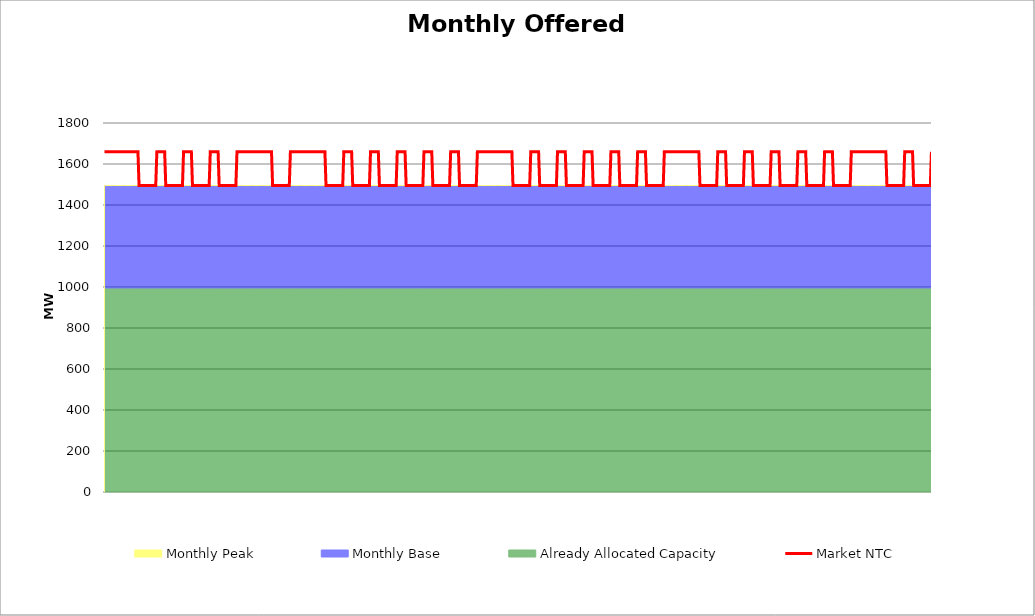
| Category | Market NTC |
|---|---|
| 0 | 1660 |
| 1 | 1660 |
| 2 | 1660 |
| 3 | 1660 |
| 4 | 1660 |
| 5 | 1660 |
| 6 | 1660 |
| 7 | 1660 |
| 8 | 1660 |
| 9 | 1660 |
| 10 | 1660 |
| 11 | 1660 |
| 12 | 1660 |
| 13 | 1660 |
| 14 | 1660 |
| 15 | 1660 |
| 16 | 1660 |
| 17 | 1660 |
| 18 | 1660 |
| 19 | 1660 |
| 20 | 1660 |
| 21 | 1660 |
| 22 | 1660 |
| 23 | 1660 |
| 24 | 1660 |
| 25 | 1660 |
| 26 | 1660 |
| 27 | 1660 |
| 28 | 1660 |
| 29 | 1660 |
| 30 | 1660 |
| 31 | 1495 |
| 32 | 1495 |
| 33 | 1495 |
| 34 | 1495 |
| 35 | 1495 |
| 36 | 1495 |
| 37 | 1495 |
| 38 | 1495 |
| 39 | 1495 |
| 40 | 1495 |
| 41 | 1495 |
| 42 | 1495 |
| 43 | 1495 |
| 44 | 1495 |
| 45 | 1495 |
| 46 | 1495 |
| 47 | 1660 |
| 48 | 1660 |
| 49 | 1660 |
| 50 | 1660 |
| 51 | 1660 |
| 52 | 1660 |
| 53 | 1660 |
| 54 | 1660 |
| 55 | 1495 |
| 56 | 1495 |
| 57 | 1495 |
| 58 | 1495 |
| 59 | 1495 |
| 60 | 1495 |
| 61 | 1495 |
| 62 | 1495 |
| 63 | 1495 |
| 64 | 1495 |
| 65 | 1495 |
| 66 | 1495 |
| 67 | 1495 |
| 68 | 1495 |
| 69 | 1495 |
| 70 | 1495 |
| 71 | 1660 |
| 72 | 1660 |
| 73 | 1660 |
| 74 | 1660 |
| 75 | 1660 |
| 76 | 1660 |
| 77 | 1660 |
| 78 | 1660 |
| 79 | 1495 |
| 80 | 1495 |
| 81 | 1495 |
| 82 | 1495 |
| 83 | 1495 |
| 84 | 1495 |
| 85 | 1495 |
| 86 | 1495 |
| 87 | 1495 |
| 88 | 1495 |
| 89 | 1495 |
| 90 | 1495 |
| 91 | 1495 |
| 92 | 1495 |
| 93 | 1495 |
| 94 | 1495 |
| 95 | 1660 |
| 96 | 1660 |
| 97 | 1660 |
| 98 | 1660 |
| 99 | 1660 |
| 100 | 1660 |
| 101 | 1660 |
| 102 | 1660 |
| 103 | 1495 |
| 104 | 1495 |
| 105 | 1495 |
| 106 | 1495 |
| 107 | 1495 |
| 108 | 1495 |
| 109 | 1495 |
| 110 | 1495 |
| 111 | 1495 |
| 112 | 1495 |
| 113 | 1495 |
| 114 | 1495 |
| 115 | 1495 |
| 116 | 1495 |
| 117 | 1495 |
| 118 | 1495 |
| 119 | 1660 |
| 120 | 1660 |
| 121 | 1660 |
| 122 | 1660 |
| 123 | 1660 |
| 124 | 1660 |
| 125 | 1660 |
| 126 | 1660 |
| 127 | 1660 |
| 128 | 1660 |
| 129 | 1660 |
| 130 | 1660 |
| 131 | 1660 |
| 132 | 1660 |
| 133 | 1660 |
| 134 | 1660 |
| 135 | 1660 |
| 136 | 1660 |
| 137 | 1660 |
| 138 | 1660 |
| 139 | 1660 |
| 140 | 1660 |
| 141 | 1660 |
| 142 | 1660 |
| 143 | 1660 |
| 144 | 1660 |
| 145 | 1660 |
| 146 | 1660 |
| 147 | 1660 |
| 148 | 1660 |
| 149 | 1660 |
| 150 | 1660 |
| 151 | 1495 |
| 152 | 1495 |
| 153 | 1495 |
| 154 | 1495 |
| 155 | 1495 |
| 156 | 1495 |
| 157 | 1495 |
| 158 | 1495 |
| 159 | 1495 |
| 160 | 1495 |
| 161 | 1495 |
| 162 | 1495 |
| 163 | 1495 |
| 164 | 1495 |
| 165 | 1495 |
| 166 | 1495 |
| 167 | 1660 |
| 168 | 1660 |
| 169 | 1660 |
| 170 | 1660 |
| 171 | 1660 |
| 172 | 1660 |
| 173 | 1660 |
| 174 | 1660 |
| 175 | 1660 |
| 176 | 1660 |
| 177 | 1660 |
| 178 | 1660 |
| 179 | 1660 |
| 180 | 1660 |
| 181 | 1660 |
| 182 | 1660 |
| 183 | 1660 |
| 184 | 1660 |
| 185 | 1660 |
| 186 | 1660 |
| 187 | 1660 |
| 188 | 1660 |
| 189 | 1660 |
| 190 | 1660 |
| 191 | 1660 |
| 192 | 1660 |
| 193 | 1660 |
| 194 | 1660 |
| 195 | 1660 |
| 196 | 1660 |
| 197 | 1660 |
| 198 | 1660 |
| 199 | 1495 |
| 200 | 1495 |
| 201 | 1495 |
| 202 | 1495 |
| 203 | 1495 |
| 204 | 1495 |
| 205 | 1495 |
| 206 | 1495 |
| 207 | 1495 |
| 208 | 1495 |
| 209 | 1495 |
| 210 | 1495 |
| 211 | 1495 |
| 212 | 1495 |
| 213 | 1495 |
| 214 | 1495 |
| 215 | 1660 |
| 216 | 1660 |
| 217 | 1660 |
| 218 | 1660 |
| 219 | 1660 |
| 220 | 1660 |
| 221 | 1660 |
| 222 | 1660 |
| 223 | 1495 |
| 224 | 1495 |
| 225 | 1495 |
| 226 | 1495 |
| 227 | 1495 |
| 228 | 1495 |
| 229 | 1495 |
| 230 | 1495 |
| 231 | 1495 |
| 232 | 1495 |
| 233 | 1495 |
| 234 | 1495 |
| 235 | 1495 |
| 236 | 1495 |
| 237 | 1495 |
| 238 | 1495 |
| 239 | 1660 |
| 240 | 1660 |
| 241 | 1660 |
| 242 | 1660 |
| 243 | 1660 |
| 244 | 1660 |
| 245 | 1660 |
| 246 | 1660 |
| 247 | 1495 |
| 248 | 1495 |
| 249 | 1495 |
| 250 | 1495 |
| 251 | 1495 |
| 252 | 1495 |
| 253 | 1495 |
| 254 | 1495 |
| 255 | 1495 |
| 256 | 1495 |
| 257 | 1495 |
| 258 | 1495 |
| 259 | 1495 |
| 260 | 1495 |
| 261 | 1495 |
| 262 | 1495 |
| 263 | 1660 |
| 264 | 1660 |
| 265 | 1660 |
| 266 | 1660 |
| 267 | 1660 |
| 268 | 1660 |
| 269 | 1660 |
| 270 | 1660 |
| 271 | 1495 |
| 272 | 1495 |
| 273 | 1495 |
| 274 | 1495 |
| 275 | 1495 |
| 276 | 1495 |
| 277 | 1495 |
| 278 | 1495 |
| 279 | 1495 |
| 280 | 1495 |
| 281 | 1495 |
| 282 | 1495 |
| 283 | 1495 |
| 284 | 1495 |
| 285 | 1495 |
| 286 | 1495 |
| 287 | 1660 |
| 288 | 1660 |
| 289 | 1660 |
| 290 | 1660 |
| 291 | 1660 |
| 292 | 1660 |
| 293 | 1660 |
| 294 | 1660 |
| 295 | 1495 |
| 296 | 1495 |
| 297 | 1495 |
| 298 | 1495 |
| 299 | 1495 |
| 300 | 1495 |
| 301 | 1495 |
| 302 | 1495 |
| 303 | 1495 |
| 304 | 1495 |
| 305 | 1495 |
| 306 | 1495 |
| 307 | 1495 |
| 308 | 1495 |
| 309 | 1495 |
| 310 | 1495 |
| 311 | 1660 |
| 312 | 1660 |
| 313 | 1660 |
| 314 | 1660 |
| 315 | 1660 |
| 316 | 1660 |
| 317 | 1660 |
| 318 | 1660 |
| 319 | 1495 |
| 320 | 1495 |
| 321 | 1495 |
| 322 | 1495 |
| 323 | 1495 |
| 324 | 1495 |
| 325 | 1495 |
| 326 | 1495 |
| 327 | 1495 |
| 328 | 1495 |
| 329 | 1495 |
| 330 | 1495 |
| 331 | 1495 |
| 332 | 1495 |
| 333 | 1495 |
| 334 | 1495 |
| 335 | 1660 |
| 336 | 1660 |
| 337 | 1660 |
| 338 | 1660 |
| 339 | 1660 |
| 340 | 1660 |
| 341 | 1660 |
| 342 | 1660 |
| 343 | 1660 |
| 344 | 1660 |
| 345 | 1660 |
| 346 | 1660 |
| 347 | 1660 |
| 348 | 1660 |
| 349 | 1660 |
| 350 | 1660 |
| 351 | 1660 |
| 352 | 1660 |
| 353 | 1660 |
| 354 | 1660 |
| 355 | 1660 |
| 356 | 1660 |
| 357 | 1660 |
| 358 | 1660 |
| 359 | 1660 |
| 360 | 1660 |
| 361 | 1660 |
| 362 | 1660 |
| 363 | 1660 |
| 364 | 1660 |
| 365 | 1660 |
| 366 | 1660 |
| 367 | 1495 |
| 368 | 1495 |
| 369 | 1495 |
| 370 | 1495 |
| 371 | 1495 |
| 372 | 1495 |
| 373 | 1495 |
| 374 | 1495 |
| 375 | 1495 |
| 376 | 1495 |
| 377 | 1495 |
| 378 | 1495 |
| 379 | 1495 |
| 380 | 1495 |
| 381 | 1495 |
| 382 | 1495 |
| 383 | 1660 |
| 384 | 1660 |
| 385 | 1660 |
| 386 | 1660 |
| 387 | 1660 |
| 388 | 1660 |
| 389 | 1660 |
| 390 | 1660 |
| 391 | 1495 |
| 392 | 1495 |
| 393 | 1495 |
| 394 | 1495 |
| 395 | 1495 |
| 396 | 1495 |
| 397 | 1495 |
| 398 | 1495 |
| 399 | 1495 |
| 400 | 1495 |
| 401 | 1495 |
| 402 | 1495 |
| 403 | 1495 |
| 404 | 1495 |
| 405 | 1495 |
| 406 | 1495 |
| 407 | 1660 |
| 408 | 1660 |
| 409 | 1660 |
| 410 | 1660 |
| 411 | 1660 |
| 412 | 1660 |
| 413 | 1660 |
| 414 | 1660 |
| 415 | 1495 |
| 416 | 1495 |
| 417 | 1495 |
| 418 | 1495 |
| 419 | 1495 |
| 420 | 1495 |
| 421 | 1495 |
| 422 | 1495 |
| 423 | 1495 |
| 424 | 1495 |
| 425 | 1495 |
| 426 | 1495 |
| 427 | 1495 |
| 428 | 1495 |
| 429 | 1495 |
| 430 | 1495 |
| 431 | 1660 |
| 432 | 1660 |
| 433 | 1660 |
| 434 | 1660 |
| 435 | 1660 |
| 436 | 1660 |
| 437 | 1660 |
| 438 | 1660 |
| 439 | 1495 |
| 440 | 1495 |
| 441 | 1495 |
| 442 | 1495 |
| 443 | 1495 |
| 444 | 1495 |
| 445 | 1495 |
| 446 | 1495 |
| 447 | 1495 |
| 448 | 1495 |
| 449 | 1495 |
| 450 | 1495 |
| 451 | 1495 |
| 452 | 1495 |
| 453 | 1495 |
| 454 | 1495 |
| 455 | 1660 |
| 456 | 1660 |
| 457 | 1660 |
| 458 | 1660 |
| 459 | 1660 |
| 460 | 1660 |
| 461 | 1660 |
| 462 | 1660 |
| 463 | 1495 |
| 464 | 1495 |
| 465 | 1495 |
| 466 | 1495 |
| 467 | 1495 |
| 468 | 1495 |
| 469 | 1495 |
| 470 | 1495 |
| 471 | 1495 |
| 472 | 1495 |
| 473 | 1495 |
| 474 | 1495 |
| 475 | 1495 |
| 476 | 1495 |
| 477 | 1495 |
| 478 | 1495 |
| 479 | 1660 |
| 480 | 1660 |
| 481 | 1660 |
| 482 | 1660 |
| 483 | 1660 |
| 484 | 1660 |
| 485 | 1660 |
| 486 | 1660 |
| 487 | 1495 |
| 488 | 1495 |
| 489 | 1495 |
| 490 | 1495 |
| 491 | 1495 |
| 492 | 1495 |
| 493 | 1495 |
| 494 | 1495 |
| 495 | 1495 |
| 496 | 1495 |
| 497 | 1495 |
| 498 | 1495 |
| 499 | 1495 |
| 500 | 1495 |
| 501 | 1495 |
| 502 | 1495 |
| 503 | 1660 |
| 504 | 1660 |
| 505 | 1660 |
| 506 | 1660 |
| 507 | 1660 |
| 508 | 1660 |
| 509 | 1660 |
| 510 | 1660 |
| 511 | 1660 |
| 512 | 1660 |
| 513 | 1660 |
| 514 | 1660 |
| 515 | 1660 |
| 516 | 1660 |
| 517 | 1660 |
| 518 | 1660 |
| 519 | 1660 |
| 520 | 1660 |
| 521 | 1660 |
| 522 | 1660 |
| 523 | 1660 |
| 524 | 1660 |
| 525 | 1660 |
| 526 | 1660 |
| 527 | 1660 |
| 528 | 1660 |
| 529 | 1660 |
| 530 | 1660 |
| 531 | 1660 |
| 532 | 1660 |
| 533 | 1660 |
| 534 | 1660 |
| 535 | 1495 |
| 536 | 1495 |
| 537 | 1495 |
| 538 | 1495 |
| 539 | 1495 |
| 540 | 1495 |
| 541 | 1495 |
| 542 | 1495 |
| 543 | 1495 |
| 544 | 1495 |
| 545 | 1495 |
| 546 | 1495 |
| 547 | 1495 |
| 548 | 1495 |
| 549 | 1495 |
| 550 | 1495 |
| 551 | 1660 |
| 552 | 1660 |
| 553 | 1660 |
| 554 | 1660 |
| 555 | 1660 |
| 556 | 1660 |
| 557 | 1660 |
| 558 | 1660 |
| 559 | 1495 |
| 560 | 1495 |
| 561 | 1495 |
| 562 | 1495 |
| 563 | 1495 |
| 564 | 1495 |
| 565 | 1495 |
| 566 | 1495 |
| 567 | 1495 |
| 568 | 1495 |
| 569 | 1495 |
| 570 | 1495 |
| 571 | 1495 |
| 572 | 1495 |
| 573 | 1495 |
| 574 | 1495 |
| 575 | 1660 |
| 576 | 1660 |
| 577 | 1660 |
| 578 | 1660 |
| 579 | 1660 |
| 580 | 1660 |
| 581 | 1660 |
| 582 | 1660 |
| 583 | 1495 |
| 584 | 1495 |
| 585 | 1495 |
| 586 | 1495 |
| 587 | 1495 |
| 588 | 1495 |
| 589 | 1495 |
| 590 | 1495 |
| 591 | 1495 |
| 592 | 1495 |
| 593 | 1495 |
| 594 | 1495 |
| 595 | 1495 |
| 596 | 1495 |
| 597 | 1495 |
| 598 | 1495 |
| 599 | 1660 |
| 600 | 1660 |
| 601 | 1660 |
| 602 | 1660 |
| 603 | 1660 |
| 604 | 1660 |
| 605 | 1660 |
| 606 | 1660 |
| 607 | 1495 |
| 608 | 1495 |
| 609 | 1495 |
| 610 | 1495 |
| 611 | 1495 |
| 612 | 1495 |
| 613 | 1495 |
| 614 | 1495 |
| 615 | 1495 |
| 616 | 1495 |
| 617 | 1495 |
| 618 | 1495 |
| 619 | 1495 |
| 620 | 1495 |
| 621 | 1495 |
| 622 | 1495 |
| 623 | 1660 |
| 624 | 1660 |
| 625 | 1660 |
| 626 | 1660 |
| 627 | 1660 |
| 628 | 1660 |
| 629 | 1660 |
| 630 | 1660 |
| 631 | 1495 |
| 632 | 1495 |
| 633 | 1495 |
| 634 | 1495 |
| 635 | 1495 |
| 636 | 1495 |
| 637 | 1495 |
| 638 | 1495 |
| 639 | 1495 |
| 640 | 1495 |
| 641 | 1495 |
| 642 | 1495 |
| 643 | 1495 |
| 644 | 1495 |
| 645 | 1495 |
| 646 | 1495 |
| 647 | 1660 |
| 648 | 1660 |
| 649 | 1660 |
| 650 | 1660 |
| 651 | 1660 |
| 652 | 1660 |
| 653 | 1660 |
| 654 | 1660 |
| 655 | 1495 |
| 656 | 1495 |
| 657 | 1495 |
| 658 | 1495 |
| 659 | 1495 |
| 660 | 1495 |
| 661 | 1495 |
| 662 | 1495 |
| 663 | 1495 |
| 664 | 1495 |
| 665 | 1495 |
| 666 | 1495 |
| 667 | 1495 |
| 668 | 1495 |
| 669 | 1495 |
| 670 | 1495 |
| 671 | 1660 |
| 672 | 1660 |
| 673 | 1660 |
| 674 | 1660 |
| 675 | 1660 |
| 676 | 1660 |
| 677 | 1660 |
| 678 | 1660 |
| 679 | 1660 |
| 680 | 1660 |
| 681 | 1660 |
| 682 | 1660 |
| 683 | 1660 |
| 684 | 1660 |
| 685 | 1660 |
| 686 | 1660 |
| 687 | 1660 |
| 688 | 1660 |
| 689 | 1660 |
| 690 | 1660 |
| 691 | 1660 |
| 692 | 1660 |
| 693 | 1660 |
| 694 | 1660 |
| 695 | 1660 |
| 696 | 1660 |
| 697 | 1660 |
| 698 | 1660 |
| 699 | 1660 |
| 700 | 1660 |
| 701 | 1660 |
| 702 | 1660 |
| 703 | 1495 |
| 704 | 1495 |
| 705 | 1495 |
| 706 | 1495 |
| 707 | 1495 |
| 708 | 1495 |
| 709 | 1495 |
| 710 | 1495 |
| 711 | 1495 |
| 712 | 1495 |
| 713 | 1495 |
| 714 | 1495 |
| 715 | 1495 |
| 716 | 1495 |
| 717 | 1495 |
| 718 | 1495 |
| 719 | 1660 |
| 720 | 1660 |
| 721 | 1660 |
| 722 | 1660 |
| 723 | 1660 |
| 724 | 1660 |
| 725 | 1660 |
| 726 | 1660 |
| 727 | 1495 |
| 728 | 1495 |
| 729 | 1495 |
| 730 | 1495 |
| 731 | 1495 |
| 732 | 1495 |
| 733 | 1495 |
| 734 | 1495 |
| 735 | 1495 |
| 736 | 1495 |
| 737 | 1495 |
| 738 | 1495 |
| 739 | 1495 |
| 740 | 1495 |
| 741 | 1495 |
| 742 | 1495 |
| 743 | 1660 |